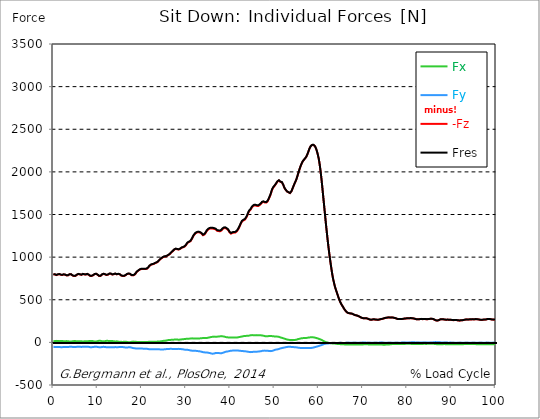
| Category |  Fx |  Fy |  -Fz |  Fres |
|---|---|---|---|---|
| 0.0 | 12.71 | -51.98 | 798.48 | 800.44 |
| 0.167348456675344 | 13.99 | -52.82 | 798.3 | 800.33 |
| 0.334696913350688 | 15.35 | -53.58 | 796.87 | 798.95 |
| 0.5020453700260321 | 16.6 | -54.59 | 793.1 | 795.28 |
| 0.669393826701376 | 17.56 | -55.71 | 789.18 | 791.46 |
| 0.83674228337672 | 16.47 | -55.96 | 790.77 | 793.04 |
| 1.0040907400520642 | 15.13 | -55.33 | 795.72 | 797.94 |
| 1.1621420602454444 | 14.09 | -54.38 | 800.67 | 802.81 |
| 1.3294905169207885 | 14.49 | -54.71 | 799.82 | 801.99 |
| 1.4968389735961325 | 15.13 | -55.06 | 797.65 | 799.87 |
| 1.6641874302714765 | 16.27 | -55.95 | 792.97 | 795.26 |
| 1.8315358869468206 | 17.29 | -57.16 | 788.36 | 790.74 |
| 1.9988843436221646 | 16.23 | -56.35 | 790.01 | 792.31 |
| 2.1662328002975086 | 14.96 | -55.09 | 793.04 | 795.24 |
| 2.333581256972853 | 13.81 | -53.45 | 796.71 | 798.78 |
| 2.5009297136481967 | 13.45 | -53.06 | 795.73 | 797.77 |
| 2.6682781703235405 | 13.52 | -53.58 | 793.1 | 795.17 |
| 2.8356266269988843 | 14.73 | -54.5 | 788.03 | 790.19 |
| 3.002975083674229 | 15.09 | -55.01 | 785.5 | 787.69 |
| 3.1703235403495724 | 14.38 | -54.78 | 784.9 | 787.06 |
| 3.337671997024917 | 13.45 | -54.58 | 786.51 | 788.63 |
| 3.4957233172182973 | 11.71 | -53.6 | 791.53 | 793.54 |
| 3.663071773893641 | 9.57 | -51.67 | 798.03 | 799.89 |
| 3.8304202305689854 | 8.76 | -50.57 | 800.06 | 801.84 |
| 3.997768687244329 | 9.16 | -50.6 | 798.48 | 800.27 |
| 4.165117143919673 | 11.25 | -51.6 | 792.11 | 793.99 |
| 4.332465600595017 | 13.64 | -53.29 | 784.07 | 786.12 |
| 4.499814057270361 | 15.28 | -54.84 | 777.87 | 780.09 |
| 4.667162513945706 | 15.01 | -55.09 | 778.17 | 780.4 |
| 4.834510970621049 | 14.51 | -54.27 | 779.33 | 781.48 |
| 5.001859427296393 | 15.25 | -54.46 | 780.16 | 782.32 |
| 5.169207883971737 | 14.04 | -53.6 | 784.96 | 787.03 |
| 5.336556340647081 | 11.99 | -52.13 | 793.8 | 795.75 |
| 5.503904797322425 | 11.73 | -51.16 | 799.26 | 801.15 |
| 5.671253253997769 | 11.71 | -50.92 | 801.78 | 803.64 |
| 5.82930457419115 | 11.84 | -50.97 | 801.59 | 803.45 |
| 5.996653030866494 | 12.63 | -51.83 | 796.91 | 798.84 |
| 6.164001487541838 | 13.67 | -53.29 | 791.19 | 793.24 |
| 6.331349944217181 | 13.41 | -53.65 | 792.16 | 794.23 |
| 6.498698400892526 | 11.94 | -52.54 | 796.41 | 798.37 |
| 6.66604685756787 | 10.03 | -50.76 | 801.65 | 803.46 |
| 6.833395314243213 | 11.13 | -51 | 801.01 | 802.85 |
| 7.000743770918558 | 12.66 | -51.61 | 797.61 | 799.51 |
| 7.168092227593902 | 13.29 | -52.18 | 793.81 | 795.76 |
| 7.335440684269246 | 12.67 | -51.96 | 795.3 | 797.23 |
| 7.50278914094459 | 11.94 | -51.52 | 799.44 | 801.33 |
| 7.6701375976199335 | 11.62 | -50.78 | 802.11 | 803.94 |
| 7.837486054295278 | 12.92 | -51.22 | 799.74 | 801.62 |
| 7.995537374488658 | 14.88 | -52.81 | 792.98 | 795.01 |
| 8.162885831164003 | 16.49 | -54.92 | 784.62 | 786.86 |
| 8.330234287839346 | 17.29 | -56.33 | 779.2 | 781.6 |
| 8.49758274451469 | 17.3 | -56.76 | 777.8 | 780.25 |
| 8.664931201190035 | 16.78 | -56.36 | 779.56 | 781.96 |
| 8.832279657865378 | 15.86 | -55.57 | 782.75 | 785.05 |
| 8.999628114540721 | 14.31 | -54.53 | 787.44 | 789.62 |
| 9.166976571216066 | 11.42 | -52.95 | 795.29 | 797.31 |
| 9.334325027891412 | 10.3 | -51.88 | 800.51 | 802.46 |
| 9.501673484566755 | 10.42 | -51.54 | 801.93 | 803.87 |
| 9.669021941242098 | 10.74 | -51.57 | 803.4 | 805.33 |
| 9.836370397917442 | 12.09 | -51.88 | 799.92 | 801.89 |
| 10.003718854592787 | 14.51 | -53.44 | 793.44 | 795.53 |
| 10.17106731126813 | 17.07 | -55.44 | 785.56 | 787.89 |
| 10.329118631461512 | 19.14 | -57.21 | 778.73 | 781.28 |
| 10.496467088136853 | 19.19 | -57.62 | 776.55 | 779.14 |
| 10.663815544812199 | 18.1 | -57.33 | 778.58 | 781.12 |
| 10.831164001487544 | 16.2 | -56.47 | 784.32 | 786.73 |
| 10.998512458162887 | 13.27 | -54.42 | 795.26 | 797.44 |
| 11.16586091483823 | 11.65 | -52.76 | 803.12 | 805.14 |
| 11.333209371513574 | 11.94 | -52.33 | 803.63 | 805.62 |
| 11.50055782818892 | 13.23 | -52.94 | 801.11 | 803.15 |
| 11.667906284864264 | 14.24 | -53.93 | 798 | 800.12 |
| 11.835254741539607 | 15.65 | -55.24 | 794.18 | 796.4 |
| 12.00260319821495 | 17.61 | -56.93 | 790.12 | 792.53 |
| 12.169951654890292 | 18.49 | -58.32 | 789.72 | 792.26 |
| 12.337300111565641 | 17.66 | -58.52 | 793.9 | 796.45 |
| 12.504648568240984 | 16.57 | -58.22 | 799.85 | 802.35 |
| 12.662699888434362 | 15.76 | -57.99 | 804.57 | 807.01 |
| 12.830048345109708 | 15.17 | -57.91 | 805.95 | 808.35 |
| 12.997396801785053 | 14.88 | -57.76 | 804.52 | 806.89 |
| 13.164745258460396 | 15.07 | -57.79 | 800.12 | 802.49 |
| 13.33209371513574 | 15.71 | -58.61 | 795.03 | 797.48 |
| 13.499442171811083 | 15.03 | -59.1 | 794.48 | 796.94 |
| 13.666790628486426 | 13.18 | -58 | 799.52 | 801.87 |
| 13.834139085161771 | 11.53 | -56.48 | 804.27 | 806.48 |
| 14.001487541837117 | 10.46 | -54.93 | 805.55 | 807.62 |
| 14.16883599851246 | 11.44 | -55.96 | 801.79 | 803.93 |
| 14.336184455187803 | 12.41 | -57.48 | 797.74 | 800 |
| 14.503532911863147 | 11.33 | -57.57 | 799.58 | 801.82 |
| 14.670881368538492 | 9.08 | -56.34 | 802.77 | 804.89 |
| 14.828932688731873 | 6.92 | -54.66 | 803.73 | 805.72 |
| 14.996281145407215 | 5.71 | -52.95 | 798.62 | 800.51 |
| 15.163629602082558 | 5.33 | -52.08 | 789.64 | 791.49 |
| 15.330978058757903 | 6 | -53.33 | 784.07 | 786.02 |
| 15.498326515433247 | 5.54 | -54.28 | 781.1 | 783.13 |
| 15.665674972108594 | 5.5 | -55.22 | 779.01 | 781.13 |
| 15.833023428783937 | 6.29 | -56.19 | 778.31 | 780.52 |
| 16.00037188545928 | 6.76 | -56.53 | 778.72 | 780.95 |
| 16.167720342134626 | 7.66 | -58.23 | 781.9 | 784.27 |
| 16.335068798809967 | 7.94 | -60.32 | 788.05 | 790.62 |
| 16.502417255485312 | 6.75 | -60.65 | 795.18 | 797.76 |
| 16.669765712160658 | 5.14 | -59.84 | 800.97 | 803.45 |
| 16.837114168836 | 4.05 | -59.47 | 803.78 | 806.19 |
| 17.004462625511344 | 2.31 | -57.94 | 805.92 | 808.21 |
| 17.16251394570472 | 2.06 | -57.41 | 804.7 | 806.93 |
| 17.32986240238007 | 2.01 | -56.88 | 802.66 | 804.86 |
| 17.497210859055414 | 3.69 | -57.95 | 796.56 | 798.84 |
| 17.664559315730756 | 6.47 | -60.9 | 787.46 | 789.95 |
| 17.8319077724061 | 8.69 | -64.31 | 784.78 | 787.6 |
| 17.999256229081443 | 9.11 | -66.56 | 785.8 | 788.83 |
| 18.166604685756788 | 8.49 | -67.29 | 788.91 | 792 |
| 18.333953142432133 | 8.23 | -68.98 | 792.84 | 796.07 |
| 18.501301599107478 | 7.6 | -70.06 | 800.13 | 803.44 |
| 18.668650055782823 | 7 | -71.29 | 811.71 | 815.08 |
| 18.835998512458165 | 5.53 | -72.07 | 826.08 | 829.44 |
| 19.00334696913351 | 4.21 | -71.64 | 835.07 | 838.36 |
| 19.170695425808855 | 3.64 | -71.47 | 839.72 | 842.96 |
| 19.338043882484197 | 3.87 | -72.07 | 844.02 | 847.3 |
| 19.496095202677576 | 3.92 | -72.8 | 852.61 | 855.92 |
| 19.66344365935292 | 4 | -73.18 | 858.04 | 861.37 |
| 19.830792116028263 | 3.94 | -73.09 | 859.12 | 862.44 |
| 19.998140572703612 | 3.7 | -72.9 | 859.35 | 862.66 |
| 20.165489029378953 | 4.18 | -73.22 | 859.76 | 863.1 |
| 20.3328374860543 | 4.61 | -73.54 | 860.1 | 863.48 |
| 20.500185942729644 | 4.45 | -73.94 | 859.58 | 862.97 |
| 20.667534399404985 | 4.3 | -74.34 | 859.06 | 862.46 |
| 20.83488285608033 | 3.58 | -74.49 | 859.85 | 863.25 |
| 21.002231312755672 | 2.96 | -74.71 | 861.01 | 864.39 |
| 21.16957976943102 | 3.37 | -75.55 | 864.44 | 867.88 |
| 21.336928226106362 | 4.07 | -76.82 | 870.19 | 873.73 |
| 21.504276682781704 | 6.87 | -79.52 | 880.35 | 884.12 |
| 21.67162513945705 | 8.54 | -80.72 | 893.44 | 897.26 |
| 21.82967645965043 | 8.65 | -80.5 | 903.01 | 906.75 |
| 21.997024916325774 | 8.21 | -80.21 | 908.14 | 911.81 |
| 22.16437337300112 | 8.51 | -80.18 | 912.27 | 915.94 |
| 22.33172182967646 | 8.46 | -79.86 | 914.8 | 918.43 |
| 22.499070286351806 | 7.3 | -79.21 | 916.49 | 920.03 |
| 22.666418743027148 | 7.7 | -79.41 | 918.88 | 922.44 |
| 22.833767199702496 | 8.45 | -80.59 | 923.25 | 926.9 |
| 23.00111565637784 | 8.54 | -81.04 | 928.75 | 932.42 |
| 23.168464113053183 | 8.43 | -80.58 | 932.04 | 935.64 |
| 23.335812569728528 | 8.48 | -80.55 | 935.45 | 939.04 |
| 23.50316102640387 | 9.03 | -80.86 | 940.36 | 943.98 |
| 23.670509483079215 | 9.41 | -81.26 | 947.14 | 950.78 |
| 23.83785793975456 | 10.11 | -82.38 | 956.5 | 960.21 |
| 23.995909259947936 | 10.62 | -82.07 | 966.6 | 970.27 |
| 24.163257716623285 | 11.1 | -82.03 | 975.08 | 978.72 |
| 24.330606173298627 | 12.54 | -82.35 | 982 | 985.68 |
| 24.49795462997397 | 14.63 | -82.95 | 989.75 | 993.5 |
| 24.665303086649313 | 16.26 | -83.08 | 994.36 | 998.12 |
| 24.83265154332466 | 17.55 | -82.87 | 999.33 | 1003.07 |
| 25.0 | 18.29 | -82.12 | 1004.49 | 1008.17 |
| 25.167348456675345 | 19.05 | -81.33 | 1005.83 | 1009.44 |
| 25.334696913350694 | 20.14 | -80.33 | 1007.4 | 1010.95 |
| 25.502045370026035 | 21.64 | -79.03 | 1009.26 | 1012.73 |
| 25.669393826701377 | 23.35 | -77.82 | 1013.22 | 1016.64 |
| 25.836742283376722 | 25.16 | -76.76 | 1017.84 | 1021.22 |
| 26.004090740052067 | 26.86 | -77.12 | 1023.89 | 1027.33 |
| 26.17143919672741 | 27.56 | -76.64 | 1028.71 | 1032.13 |
| 26.329490516920792 | 28.12 | -76.26 | 1035.89 | 1039.28 |
| 26.49683897359613 | 28.82 | -75.95 | 1045.49 | 1048.86 |
| 26.66418743027148 | 29.82 | -75.82 | 1054.14 | 1057.5 |
| 26.831535886946828 | 29.7 | -76.05 | 1061.34 | 1064.69 |
| 26.998884343622166 | 30.86 | -77.17 | 1070.51 | 1073.94 |
| 27.166232800297514 | 31.72 | -77.45 | 1080.44 | 1083.89 |
| 27.333581256972852 | 32.56 | -77.8 | 1087.71 | 1091.19 |
| 27.5009297136482 | 32.47 | -77.27 | 1092.62 | 1096.04 |
| 27.668278170323543 | 32.6 | -76.57 | 1096.59 | 1099.95 |
| 27.835626626998888 | 32.73 | -75.96 | 1096.48 | 1099.8 |
| 28.002975083674233 | 32.89 | -76.4 | 1092.22 | 1095.59 |
| 28.170323540349575 | 31.83 | -76.59 | 1087.85 | 1091.22 |
| 28.33767199702492 | 31.55 | -76.24 | 1088.71 | 1092.06 |
| 28.50502045370026 | 32.78 | -76.76 | 1090.98 | 1094.4 |
| 28.663071773893645 | 32.58 | -76.79 | 1096.63 | 1100.05 |
| 28.830420230568986 | 34.05 | -78.35 | 1102.92 | 1106.49 |
| 28.99776868724433 | 35.29 | -79.75 | 1110.07 | 1113.77 |
| 29.165117143919673 | 35.97 | -80.28 | 1112.37 | 1116.14 |
| 29.33246560059502 | 36.61 | -81.46 | 1115.08 | 1118.99 |
| 29.499814057270367 | 37.39 | -82.95 | 1118.26 | 1122.33 |
| 29.66716251394571 | 39.23 | -85.2 | 1123.55 | 1127.96 |
| 29.834510970621054 | 40.79 | -87.2 | 1129.91 | 1134.62 |
| 30.00185942729639 | 41.24 | -87.9 | 1141.13 | 1145.92 |
| 30.169207883971744 | 41.09 | -87.12 | 1155.29 | 1160.01 |
| 30.33655634064708 | 41.24 | -86.79 | 1167.37 | 1172.06 |
| 30.50390479732243 | 42.4 | -88.53 | 1173.14 | 1178 |
| 30.671253253997772 | 43.37 | -90.83 | 1176.84 | 1181.96 |
| 30.829304574191156 | 44.35 | -93.12 | 1180.54 | 1185.91 |
| 30.996653030866494 | 45.15 | -94.67 | 1186.3 | 1191.83 |
| 31.164001487541842 | 46.35 | -96.56 | 1197.31 | 1202.98 |
| 31.331349944217187 | 47.13 | -97.57 | 1214.39 | 1220.1 |
| 31.498698400892525 | 46.97 | -97.57 | 1232.78 | 1238.39 |
| 31.666046857567874 | 46.38 | -97.13 | 1248.3 | 1253.82 |
| 31.833395314243212 | 45.96 | -97.2 | 1261.91 | 1267.36 |
| 32.00074377091856 | 45.67 | -97.82 | 1273.25 | 1278.68 |
| 32.1680922275939 | 45.15 | -98.64 | 1281.15 | 1286.62 |
| 32.33544068426925 | 45.26 | -99.92 | 1286.41 | 1291.98 |
| 32.50278914094459 | 45.74 | -101.13 | 1289.81 | 1295.48 |
| 32.670137597619934 | 46.06 | -102.52 | 1292.23 | 1297.98 |
| 32.83748605429528 | 45.88 | -103.13 | 1293.41 | 1299.17 |
| 33.004834510970625 | 46.58 | -104.54 | 1290.72 | 1296.58 |
| 33.162885831164004 | 46.95 | -105.75 | 1287.79 | 1293.8 |
| 33.33023428783935 | 47.31 | -107.08 | 1284.04 | 1290.22 |
| 33.497582744514695 | 48.36 | -109.53 | 1276.33 | 1282.76 |
| 33.664931201190036 | 49.9 | -112.32 | 1264.85 | 1271.55 |
| 33.83227965786538 | 51.22 | -114.95 | 1256.28 | 1263.27 |
| 33.99962811454073 | 51.58 | -116.61 | 1258.37 | 1265.58 |
| 34.16697657121607 | 51.55 | -117.23 | 1265.72 | 1272.99 |
| 34.33432502789141 | 51.53 | -117.85 | 1274.72 | 1282.04 |
| 34.50167348456676 | 51.4 | -117.98 | 1289.16 | 1296.46 |
| 34.6690219412421 | 51.05 | -117.94 | 1305.75 | 1313.03 |
| 34.83637039791744 | 52.56 | -119.48 | 1316.03 | 1323.48 |
| 35.00371885459279 | 54.86 | -121.61 | 1325.04 | 1332.73 |
| 35.17106731126814 | 57.01 | -123.24 | 1331.28 | 1339.17 |
| 35.338415767943474 | 58.7 | -124.72 | 1334.18 | 1342.25 |
| 35.49646708813686 | 60.31 | -127.17 | 1335.94 | 1344.33 |
| 35.6638155448122 | 62.71 | -129.91 | 1336.74 | 1345.52 |
| 35.831164001487544 | 64.35 | -132.1 | 1336.25 | 1345.38 |
| 35.998512458162885 | 65.69 | -132.87 | 1335.2 | 1344.53 |
| 36.165860914838234 | 66.93 | -132.19 | 1333.94 | 1343.28 |
| 36.333209371513576 | 67.63 | -131 | 1330.81 | 1340.1 |
| 36.50055782818892 | 67.55 | -128.79 | 1327.94 | 1337.03 |
| 36.667906284864266 | 66.22 | -124.94 | 1326.21 | 1334.79 |
| 36.83525474153961 | 66.01 | -124.44 | 1318.38 | 1326.84 |
| 37.002603198214956 | 67.03 | -125.01 | 1309.05 | 1317.64 |
| 37.1699516548903 | 68.35 | -125.72 | 1302.44 | 1311.2 |
| 37.337300111565646 | 68.17 | -124.92 | 1305.35 | 1314 |
| 37.50464856824098 | 69.02 | -125.29 | 1305.44 | 1314.2 |
| 37.66269988843437 | 70.76 | -126.74 | 1303.08 | 1312.13 |
| 37.83004834510971 | 72.22 | -127.59 | 1304.7 | 1313.95 |
| 37.99739680178505 | 73.34 | -127.27 | 1311.31 | 1320.6 |
| 38.16474525846039 | 71.68 | -124.39 | 1324.32 | 1333.49 |
| 38.33209371513574 | 70.02 | -122 | 1333.14 | 1342.11 |
| 38.49944217181109 | 68.96 | -119.54 | 1338.01 | 1346.68 |
| 38.666790628486424 | 67.5 | -115.87 | 1341.61 | 1349.9 |
| 38.83413908516178 | 64.55 | -112.45 | 1342.02 | 1349.88 |
| 39.001487541837115 | 61.84 | -109.24 | 1339.39 | 1346.95 |
| 39.16883599851246 | 60.21 | -107.85 | 1332.95 | 1340.41 |
| 39.336184455187805 | 59.39 | -107.35 | 1326.34 | 1333.76 |
| 39.503532911863154 | 58.57 | -105.96 | 1320.04 | 1327.4 |
| 39.670881368538495 | 57.41 | -103.62 | 1310.34 | 1317.6 |
| 39.83822982521384 | 57.73 | -101 | 1290.32 | 1297.59 |
| 39.996281145407224 | 57.2 | -98.87 | 1278.66 | 1285.94 |
| 40.163629602082565 | 57.43 | -97.6 | 1275.36 | 1282.74 |
| 40.33097805875791 | 57.76 | -97.18 | 1278.59 | 1286.03 |
| 40.498326515433256 | 57.59 | -96.24 | 1285.36 | 1292.7 |
| 40.6656749721086 | 57.59 | -95.89 | 1289.72 | 1297.08 |
| 40.83302342878393 | 57.77 | -96.19 | 1287.09 | 1294.6 |
| 41.00037188545929 | 58.15 | -96.3 | 1286.35 | 1293.99 |
| 41.16772034213463 | 58.03 | -95.71 | 1289.16 | 1296.86 |
| 41.33506879880997 | 57.47 | -94.53 | 1295.58 | 1303.29 |
| 41.50241725548531 | 57.36 | -93.89 | 1303.88 | 1311.53 |
| 41.66976571216066 | 58.51 | -94.96 | 1315.3 | 1323.02 |
| 41.837114168836 | 60.46 | -96.16 | 1330.08 | 1337.89 |
| 42.004462625511344 | 62.22 | -97.72 | 1347.29 | 1355.1 |
| 42.17181108218669 | 64.09 | -99.26 | 1366.21 | 1374 |
| 42.32986240238007 | 65.63 | -99.67 | 1386.58 | 1394.3 |
| 42.497210859055414 | 67.08 | -99.51 | 1404.7 | 1412.32 |
| 42.66455931573076 | 69.08 | -100.64 | 1419.44 | 1427.08 |
| 42.831907772406105 | 71.3 | -101.92 | 1428.31 | 1436.08 |
| 42.999256229081446 | 73.37 | -102.89 | 1431.12 | 1439.1 |
| 43.16660468575679 | 74.57 | -103.07 | 1434.33 | 1442.41 |
| 43.33395314243214 | 75.72 | -104.21 | 1440.61 | 1448.82 |
| 43.50130159910748 | 76.39 | -105.87 | 1452 | 1460.29 |
| 43.66865005578282 | 76.29 | -106.95 | 1468.25 | 1476.49 |
| 43.83599851245817 | 76.5 | -107.8 | 1486.64 | 1494.86 |
| 44.00334696913351 | 77.36 | -109.53 | 1508.9 | 1517.21 |
| 44.17069542580886 | 78.33 | -111.86 | 1528.74 | 1537.14 |
| 44.3380438824842 | 79.82 | -113.17 | 1542.47 | 1551 |
| 44.49609520267758 | 82.98 | -115.41 | 1548.86 | 1557.96 |
| 44.66344365935292 | 84.73 | -114.4 | 1561.66 | 1570.68 |
| 44.83079211602827 | 85.17 | -113.12 | 1578.08 | 1586.93 |
| 44.99814057270361 | 85.18 | -112.63 | 1590.26 | 1599.05 |
| 45.16548902937895 | 84.4 | -111.15 | 1600.51 | 1609.11 |
| 45.332837486054295 | 83.64 | -109.26 | 1604.53 | 1612.94 |
| 45.500185942729644 | 83.8 | -108.34 | 1604.99 | 1613.3 |
| 45.66753439940499 | 83.81 | -108.85 | 1606.22 | 1614.55 |
| 45.83488285608033 | 84.42 | -109.07 | 1604.37 | 1612.78 |
| 46.00223131275568 | 85.11 | -108.7 | 1601.14 | 1609.61 |
| 46.16957976943102 | 84.14 | -108.53 | 1600.09 | 1608.45 |
| 46.336928226106366 | 83.17 | -108.36 | 1599.05 | 1607.29 |
| 46.50427668278171 | 82.99 | -108.22 | 1602.88 | 1611.12 |
| 46.671625139457056 | 82.87 | -105.35 | 1611.83 | 1619.69 |
| 46.829676459650436 | 83.17 | -104.35 | 1616.44 | 1624.25 |
| 46.99702491632577 | 82.26 | -103.15 | 1628.47 | 1636.19 |
| 47.16437337300112 | 80.72 | -100.03 | 1641.27 | 1648.68 |
| 47.33172182967646 | 79.49 | -97.81 | 1646.49 | 1653.65 |
| 47.49907028635181 | 78.87 | -96.9 | 1647.71 | 1654.75 |
| 47.66641874302716 | 76 | -96.71 | 1640.34 | 1647.19 |
| 47.83376719970249 | 73.57 | -97.89 | 1639.78 | 1646.6 |
| 48.001115656377834 | 71.19 | -97.02 | 1637.68 | 1644.33 |
| 48.16846411305319 | 70.36 | -96.78 | 1640.13 | 1646.65 |
| 48.33581256972853 | 71.13 | -97.46 | 1646.28 | 1652.96 |
| 48.50316102640387 | 72.5 | -98.9 | 1658.68 | 1665.65 |
| 48.67050948307921 | 73.58 | -100.15 | 1677.93 | 1685.08 |
| 48.837857939754564 | 74.88 | -101.55 | 1697.57 | 1704.87 |
| 49.005206396429905 | 75.72 | -102.65 | 1716.75 | 1724.09 |
| 49.163257716623285 | 75.58 | -102.8 | 1741.78 | 1748.99 |
| 49.33060617329863 | 74.23 | -100.96 | 1770.72 | 1777.51 |
| 49.49795462997397 | 72.66 | -99.08 | 1795.29 | 1801.68 |
| 49.66530308664932 | 71.4 | -97.28 | 1812.11 | 1818.21 |
| 49.832651543324666 | 70.64 | -93.46 | 1820.67 | 1826.4 |
| 50.0 | 70.06 | -89.34 | 1834.14 | 1839.43 |
| 50.16734845667534 | 69.36 | -87.01 | 1845.96 | 1850.94 |
| 50.33469691335069 | 68.53 | -84.95 | 1858.51 | 1863.19 |
| 50.50204537002604 | 67.55 | -83.73 | 1873.15 | 1877.65 |
| 50.66939382670139 | 67.47 | -82.04 | 1886.02 | 1890.34 |
| 50.836742283376715 | 66.31 | -79.27 | 1895.31 | 1899.28 |
| 51.00409074005207 | 65.36 | -77.24 | 1898.52 | 1902.18 |
| 51.17143919672741 | 61.54 | -74.08 | 1889.45 | 1892.76 |
| 51.32949051692079 | 57.37 | -71.29 | 1883.01 | 1886.01 |
| 51.496838973596134 | 54.88 | -68.73 | 1882.63 | 1885.42 |
| 51.66418743027148 | 53.46 | -66.69 | 1877.89 | 1880.52 |
| 51.831535886946824 | 50.85 | -64.45 | 1866.5 | 1868.96 |
| 51.99888434362217 | 47.93 | -62.62 | 1845.68 | 1847.92 |
| 52.16623280029752 | 45.05 | -61.08 | 1820.69 | 1822.72 |
| 52.33358125697285 | 42.3 | -59.66 | 1804.49 | 1806.36 |
| 52.5009297136482 | 38.9 | -57.12 | 1790.84 | 1792.46 |
| 52.668278170323546 | 36.49 | -55.62 | 1782.06 | 1783.55 |
| 52.835626626998895 | 33.89 | -54.59 | 1770.06 | 1771.46 |
| 53.00297508367424 | 31.8 | -52.63 | 1764.07 | 1765.38 |
| 53.17032354034958 | 30.01 | -50.38 | 1760.83 | 1762.08 |
| 53.33767199702492 | 29.28 | -51.15 | 1754.81 | 1756.04 |
| 53.50502045370027 | 29.02 | -52.54 | 1750.8 | 1752.02 |
| 53.663071773893655 | 27.74 | -52.7 | 1758.47 | 1759.62 |
| 53.83042023056899 | 27.4 | -53.61 | 1772.47 | 1773.62 |
| 53.99776868724433 | 27.4 | -53.64 | 1794 | 1795.13 |
| 54.16511714391967 | 27.32 | -54.65 | 1815.69 | 1816.83 |
| 54.33246560059503 | 27.24 | -55.65 | 1837.39 | 1838.53 |
| 54.49981405727037 | 27.62 | -56.87 | 1858.26 | 1859.42 |
| 54.667162513945705 | 28.89 | -58.16 | 1877.68 | 1878.9 |
| 54.834510970621054 | 30.49 | -58.25 | 1897.12 | 1898.34 |
| 55.0018594272964 | 32.19 | -58.74 | 1919.62 | 1920.86 |
| 55.169207883971744 | 34.81 | -60.19 | 1947.49 | 1948.8 |
| 55.336556340647086 | 38.56 | -62.16 | 1976.67 | 1978.08 |
| 55.50390479732243 | 40.23 | -63.02 | 2004.48 | 2005.93 |
| 55.671253253997776 | 42.25 | -64.32 | 2032.03 | 2033.55 |
| 55.83860171067312 | 44.89 | -65.48 | 2057.14 | 2058.74 |
| 55.9966530308665 | 46.64 | -65.78 | 2079.57 | 2081.21 |
| 56.16400148754184 | 47.91 | -65.84 | 2100.04 | 2101.7 |
| 56.33134994421718 | 49.48 | -65.8 | 2118.31 | 2119.99 |
| 56.498698400892536 | 50.05 | -65.36 | 2131.21 | 2132.88 |
| 56.66604685756788 | 50.53 | -65.2 | 2141.93 | 2143.6 |
| 56.83339531424321 | 50.71 | -65.01 | 2152.38 | 2154.04 |
| 57.00074377091856 | 50.89 | -64.81 | 2162.83 | 2164.49 |
| 57.16809222759391 | 51.2 | -64.69 | 2174.48 | 2176.14 |
| 57.33544068426925 | 53.04 | -65.61 | 2192.89 | 2194.61 |
| 57.5027891409446 | 54.85 | -66.62 | 2213.92 | 2215.71 |
| 57.670137597619934 | 56.37 | -66.85 | 2237.43 | 2239.25 |
| 57.83748605429528 | 57.59 | -66.42 | 2262.35 | 2264.18 |
| 58.004834510970625 | 58.44 | -66.25 | 2282.35 | 2284.18 |
| 58.16288583116401 | 58.93 | -65.56 | 2299.05 | 2300.86 |
| 58.330234287839346 | 59.86 | -64.98 | 2309.8 | 2311.61 |
| 58.497582744514695 | 60.29 | -64.28 | 2315.02 | 2316.81 |
| 58.66493120119004 | 59.96 | -62.91 | 2317.16 | 2318.9 |
| 58.832279657865385 | 58.93 | -60.51 | 2316.31 | 2317.97 |
| 58.999628114540734 | 56.92 | -57.55 | 2310.26 | 2311.81 |
| 59.16697657121607 | 54.93 | -55.04 | 2298.95 | 2300.4 |
| 59.33432502789142 | 53.06 | -52.96 | 2280.06 | 2281.44 |
| 59.50167348456676 | 50.86 | -50.7 | 2257.35 | 2258.65 |
| 59.66902194124211 | 48.11 | -48.04 | 2228.02 | 2229.18 |
| 59.83637039791745 | 44.93 | -45.4 | 2193.26 | 2194.32 |
| 60.00371885459278 | 42.24 | -42.96 | 2154.67 | 2155.64 |
| 60.17106731126813 | 39.06 | -40.14 | 2103.51 | 2104.39 |
| 60.33841576794349 | 35.72 | -36.91 | 2042.53 | 2043.3 |
| 60.49646708813685 | 32.27 | -34.11 | 1970.63 | 1971.31 |
| 60.6638155448122 | 28.04 | -30.96 | 1893.32 | 1893.91 |
| 60.831164001487544 | 23.55 | -27.67 | 1807.62 | 1808.13 |
| 60.99851245816289 | 18.38 | -23.65 | 1718.54 | 1718.96 |
| 61.16586091483824 | 13.49 | -20.4 | 1632.52 | 1632.89 |
| 61.333209371513576 | 8.9 | -17.92 | 1544.35 | 1544.66 |
| 61.50055782818892 | 5.22 | -16.1 | 1456.01 | 1456.29 |
| 61.667906284864266 | 1.99 | -14.65 | 1370.09 | 1370.34 |
| 61.835254741539615 | -0.72 | -13.7 | 1288.55 | 1288.79 |
| 62.002603198214956 | -2.68 | -13.2 | 1210.22 | 1210.45 |
| 62.16995165489029 | -5.03 | -12.2 | 1134.24 | 1134.48 |
| 62.33730011156564 | -6.78 | -11.29 | 1063.54 | 1063.8 |
| 62.504648568240995 | -8.14 | -10.14 | 997.71 | 998 |
| 62.67199702491633 | -9.57 | -8.79 | 935.32 | 935.62 |
| 62.83004834510971 | -11 | -8.14 | 875.09 | 875.41 |
| 62.99739680178505 | -12.11 | -7.84 | 819 | 819.35 |
| 63.1647452584604 | -12.93 | -7.66 | 767.82 | 768.2 |
| 63.33209371513575 | -13.48 | -7.67 | 725.99 | 726.4 |
| 63.4994421718111 | -13.45 | -8.38 | 688.77 | 689.17 |
| 63.666790628486424 | -13.8 | -8.54 | 653.74 | 654.1 |
| 63.83413908516177 | -15.25 | -7.67 | 624.94 | 625.28 |
| 64.00148754183712 | -17.02 | -6.77 | 599.42 | 599.78 |
| 64.16883599851248 | -18.52 | -6.13 | 574.29 | 574.67 |
| 64.3361844551878 | -19.2 | -6.04 | 547.18 | 547.6 |
| 64.50353291186315 | -19.59 | -5.72 | 522.25 | 522.69 |
| 64.6708813685385 | -19.57 | -5.99 | 498.19 | 498.66 |
| 64.83822982521384 | -21.3 | -5.51 | 477.34 | 477.91 |
| 65.00557828188919 | -21.8 | -5.57 | 458.42 | 459.03 |
| 65.16362960208257 | -21.52 | -5.78 | 442.37 | 443 |
| 65.3309780587579 | -21.08 | -6.99 | 428.99 | 429.65 |
| 65.49832651543326 | -22.16 | -6.3 | 416.26 | 417.01 |
| 65.6656749721086 | -22.92 | -5.99 | 399.89 | 400.7 |
| 65.83302342878395 | -23.35 | -6.21 | 385.7 | 386.58 |
| 66.00037188545929 | -24.26 | -5.93 | 374.21 | 375.16 |
| 66.16772034213463 | -24.74 | -5.84 | 363.37 | 364.39 |
| 66.33506879880998 | -24.98 | -5.61 | 354.31 | 355.39 |
| 66.50241725548531 | -25.19 | -5.22 | 347.8 | 348.91 |
| 66.66976571216065 | -25.15 | -5.31 | 344.6 | 345.72 |
| 66.83711416883601 | -25 | -5.34 | 342.04 | 343.15 |
| 67.00446262551135 | -24.76 | -5.34 | 339.97 | 341.09 |
| 67.1718110821867 | -24.82 | -4.95 | 338.74 | 339.85 |
| 67.32986240238007 | -24.94 | -4.53 | 337.67 | 338.78 |
| 67.49721085905541 | -24.92 | -4.39 | 336.38 | 337.5 |
| 67.66455931573076 | -24.86 | -4.28 | 334.08 | 335.2 |
| 67.83190777240611 | -24.72 | -4.25 | 328.64 | 329.76 |
| 67.99925622908145 | -24.74 | -4.13 | 323.47 | 324.61 |
| 68.16660468575678 | -24.59 | -3.88 | 319.62 | 320.76 |
| 68.33395314243214 | -24.04 | -3.57 | 318.2 | 319.3 |
| 68.50130159910749 | -24.03 | -3.65 | 316.42 | 317.54 |
| 68.66865005578282 | -24.08 | -3.46 | 313.6 | 314.73 |
| 68.83599851245816 | -24.12 | -3.23 | 310.57 | 311.71 |
| 69.00334696913352 | -24.12 | -3.03 | 307.66 | 308.81 |
| 69.17069542580886 | -24.04 | -3.08 | 303.07 | 304.22 |
| 69.3380438824842 | -23.95 | -3.2 | 297.84 | 299.01 |
| 69.50539233915956 | -24.12 | -3.28 | 292.48 | 293.66 |
| 69.66344365935292 | -24.25 | -3.21 | 287.92 | 289.11 |
| 69.83079211602826 | -24.23 | -2.75 | 285.54 | 286.72 |
| 69.99814057270362 | -23.79 | -2.72 | 283.74 | 284.87 |
| 70.16548902937896 | -23.39 | -2.62 | 282.27 | 283.35 |
| 70.33283748605429 | -23.04 | -2.48 | 282.02 | 283.06 |
| 70.50018594272964 | -22.46 | -2.86 | 282.41 | 283.42 |
| 70.667534399405 | -22.67 | -2.86 | 282.68 | 283.73 |
| 70.83488285608033 | -23.23 | -3.02 | 281.74 | 282.85 |
| 71.00223131275568 | -23.36 | -3.62 | 278.98 | 280.14 |
| 71.16957976943102 | -23.31 | -4.27 | 275.16 | 276.35 |
| 71.33692822610637 | -23.67 | -4.19 | 271.49 | 272.73 |
| 71.50427668278171 | -24.02 | -4.11 | 267.81 | 269.1 |
| 71.67162513945706 | -24.41 | -4.14 | 265.83 | 267.17 |
| 71.8389735961324 | -24.8 | -4.19 | 264.19 | 265.58 |
| 71.99702491632577 | -25.23 | -4.11 | 264.86 | 266.29 |
| 72.16437337300113 | -25.56 | -4.05 | 267.66 | 269.12 |
| 72.33172182967647 | -25.61 | -4.21 | 269.99 | 271.45 |
| 72.49907028635181 | -25.65 | -4.17 | 270.17 | 271.64 |
| 72.66641874302715 | -25.28 | -4.56 | 267.98 | 269.45 |
| 72.8337671997025 | -24.29 | -5.28 | 266.28 | 267.64 |
| 73.00111565637783 | -24.39 | -4.53 | 266.03 | 267.4 |
| 73.16846411305319 | -24.9 | -4.08 | 265.32 | 266.77 |
| 73.33581256972853 | -25.24 | -3.65 | 264.73 | 266.24 |
| 73.50316102640387 | -25.1 | -3.29 | 264.49 | 266 |
| 73.67050948307921 | -25.52 | -2.92 | 265.99 | 267.55 |
| 73.83785793975457 | -26.01 | -2.79 | 268.94 | 270.54 |
| 74.00520639642991 | -26.35 | -2.72 | 271.65 | 273.29 |
| 74.16325771662328 | -26.19 | -2.52 | 273.13 | 274.73 |
| 74.33060617329863 | -26.34 | -2.6 | 274.57 | 276.19 |
| 74.49795462997398 | -26.87 | -3 | 276.47 | 278.15 |
| 74.66530308664932 | -26.62 | -3.6 | 279.74 | 281.38 |
| 74.83265154332466 | -26.74 | -3.69 | 282.95 | 284.62 |
| 75.00000000000001 | -26.72 | -3.88 | 285.81 | 287.51 |
| 75.16734845667534 | -25.88 | -4.45 | 287.27 | 288.79 |
| 75.3346969133507 | -25.79 | -4.19 | 287.75 | 289.25 |
| 75.50204537002605 | -25.46 | -4.11 | 289.6 | 291.06 |
| 75.66939382670138 | -24.61 | -3.93 | 292.95 | 294.24 |
| 75.83674228337672 | -24.13 | -4.4 | 292.46 | 293.72 |
| 76.00409074005208 | -23.64 | -4.87 | 291.97 | 293.2 |
| 76.17143919672742 | -23.01 | -4.97 | 291.16 | 292.32 |
| 76.33878765340276 | -22.09 | -5.49 | 291.51 | 292.58 |
| 76.49683897359614 | -20.41 | -5.48 | 292.38 | 293.28 |
| 76.66418743027148 | -19.29 | -4.81 | 292.54 | 293.36 |
| 76.83153588694682 | -18.44 | -5.02 | 290.27 | 291.04 |
| 76.99888434362218 | -18.09 | -5.4 | 285.75 | 286.51 |
| 77.16623280029752 | -18.25 | -5.04 | 285.6 | 286.37 |
| 77.33358125697285 | -18.19 | -4.88 | 286.18 | 286.97 |
| 77.5009297136482 | -17.81 | -5.58 | 280.99 | 281.81 |
| 77.66827817032356 | -18.24 | -4.9 | 277.58 | 278.43 |
| 77.83562662699889 | -18.65 | -4.88 | 273.89 | 274.79 |
| 78.00297508367423 | -18.61 | -4.63 | 272.89 | 273.81 |
| 78.17032354034959 | -18.59 | -4.02 | 272.73 | 273.66 |
| 78.33767199702493 | -18.58 | -3.41 | 272.57 | 273.5 |
| 78.50502045370027 | -18.59 | -3.02 | 272.71 | 273.65 |
| 78.67236891037561 | -18.61 | -2.81 | 273.09 | 274.05 |
| 78.83042023056899 | -18.82 | -2.37 | 273.81 | 274.77 |
| 78.99776868724433 | -19.1 | -1.85 | 274.64 | 275.63 |
| 79.16511714391969 | -18.99 | -1.57 | 276.46 | 277.44 |
| 79.33246560059503 | -18.42 | -1.75 | 279.06 | 279.98 |
| 79.49981405727036 | -17.77 | -1.55 | 279.51 | 280.42 |
| 79.66716251394571 | -17.36 | -0.84 | 280.17 | 281.09 |
| 79.83451097062107 | -17.17 | 0.02 | 281.15 | 282.06 |
| 80.00185942729641 | -17.09 | -0.24 | 281.23 | 282.11 |
| 80.16920788397174 | -16.84 | -1.04 | 281.88 | 282.67 |
| 80.33655634064709 | -16.46 | -2.04 | 283.07 | 283.79 |
| 80.50390479732243 | -16.94 | -1.57 | 282.89 | 283.63 |
| 80.67125325399778 | -16.97 | -1.02 | 283.54 | 284.29 |
| 80.83860171067312 | -17.4 | -0.54 | 284.46 | 285.26 |
| 80.99665303086651 | -18.21 | 0.33 | 282.97 | 283.85 |
| 81.16400148754184 | -18.73 | 0.79 | 281.97 | 282.91 |
| 81.3313499442172 | -19.38 | 0.92 | 282.03 | 283 |
| 81.49869840089255 | -19.29 | 0.39 | 280 | 280.94 |
| 81.66604685756786 | -19.73 | 0.29 | 277.52 | 278.49 |
| 81.83339531424322 | -19.66 | 0.08 | 274.51 | 275.46 |
| 82.00074377091858 | -18.78 | -0.79 | 270.76 | 271.6 |
| 82.16809222759392 | -18.7 | -1.06 | 270.25 | 271.08 |
| 82.33544068426926 | -18.61 | -1.4 | 270.41 | 271.24 |
| 82.50278914094459 | -18.4 | -1.94 | 270.61 | 271.43 |
| 82.67013759761994 | -18.41 | -2.22 | 272.52 | 273.32 |
| 82.83748605429528 | -18.01 | -2 | 272.06 | 272.81 |
| 83.00483451097062 | -18.07 | -1.95 | 272.57 | 273.33 |
| 83.17218296764597 | -18.07 | -1.57 | 274.97 | 275.74 |
| 83.33023428783935 | -17.78 | -2 | 273.09 | 273.87 |
| 83.4975827445147 | -18.05 | -1.71 | 271.85 | 272.68 |
| 83.66493120119004 | -17.64 | -1.42 | 273.28 | 274.08 |
| 83.83227965786537 | -17.42 | -1.36 | 274.16 | 274.97 |
| 83.99962811454073 | -17.58 | -1.16 | 274.13 | 274.98 |
| 84.16697657121607 | -17.65 | -1.22 | 272.43 | 273.28 |
| 84.33432502789142 | -17.78 | -0.63 | 273.37 | 274.21 |
| 84.50167348456677 | -17.62 | -0.49 | 271.63 | 272.43 |
| 84.6690219412421 | -17.39 | -0.6 | 271.28 | 272.06 |
| 84.83637039791745 | -17.18 | -0.69 | 272.95 | 273.72 |
| 85.0037188545928 | -17.23 | -0.85 | 274.7 | 275.47 |
| 85.17106731126813 | -17.02 | -0.93 | 275.69 | 276.45 |
| 85.33841576794349 | -17.24 | -0.41 | 276.6 | 277.35 |
| 85.50576422461883 | -16.59 | -0.94 | 276.14 | 276.84 |
| 85.66381554481221 | -16.52 | -0.63 | 275.19 | 275.89 |
| 85.83116400148755 | -16.78 | 0.14 | 274.73 | 275.44 |
| 85.99851245816289 | -16.97 | 0.39 | 270.55 | 271.27 |
| 86.16586091483823 | -18.32 | 2.49 | 265.86 | 266.73 |
| 86.33320937151358 | -19.66 | 3.35 | 261.81 | 262.84 |
| 86.50055782818893 | -20.17 | 3.22 | 257.71 | 258.76 |
| 86.66790628486427 | -20.87 | 2.66 | 255.5 | 256.61 |
| 86.83525474153961 | -21.21 | 2.42 | 255.45 | 256.58 |
| 87.00260319821496 | -21.44 | 2.61 | 256.89 | 258.02 |
| 87.16995165489031 | -21.21 | 2.21 | 260.12 | 261.2 |
| 87.33730011156564 | -20.67 | 0.9 | 265.45 | 266.41 |
| 87.504648568241 | -20.52 | -0.27 | 269.67 | 270.61 |
| 87.67199702491634 | -20.81 | -0.77 | 271.02 | 271.99 |
| 87.83004834510972 | -20.8 | -1.67 | 270.61 | 271.59 |
| 87.99739680178506 | -20.83 | -1.87 | 270.21 | 271.2 |
| 88.1647452584604 | -20.83 | -1.71 | 269.93 | 270.92 |
| 88.33209371513574 | -20.32 | -2.24 | 268.43 | 269.38 |
| 88.49944217181108 | -20.13 | -2.3 | 266.85 | 267.79 |
| 88.66679062848644 | -20.65 | -2.36 | 266.03 | 267 |
| 88.83413908516178 | -21.19 | -2.54 | 265.16 | 266.16 |
| 89.00148754183712 | -21.86 | -2.57 | 266.44 | 267.49 |
| 89.16883599851246 | -22.08 | -2.8 | 266.3 | 267.38 |
| 89.33618445518782 | -22.03 | -3.09 | 265.23 | 266.33 |
| 89.50353291186315 | -22.34 | -3 | 264.22 | 265.36 |
| 89.6708813685385 | -22.83 | -2.86 | 263.71 | 264.91 |
| 89.83822982521386 | -23.2 | -3.05 | 264.31 | 265.56 |
| 90.00557828188919 | -23.23 | -3.02 | 264.5 | 265.78 |
| 90.16362960208257 | -23.6 | -3.24 | 261.75 | 263.11 |
| 90.3309780587579 | -23.39 | -3.7 | 259.85 | 261.22 |
| 90.49832651543326 | -23.39 | -3.55 | 259.76 | 261.13 |
| 90.66567497210859 | -22.44 | -4.34 | 260.78 | 262.02 |
| 90.83302342878395 | -22.11 | -4.41 | 262.5 | 263.68 |
| 91.00037188545929 | -22.16 | -4.77 | 261.96 | 263.16 |
| 91.16772034213463 | -22.38 | -5.1 | 261.03 | 262.28 |
| 91.33506879880998 | -22.58 | -5.46 | 260.1 | 261.4 |
| 91.50241725548533 | -22.67 | -5.83 | 257.84 | 259.19 |
| 91.66976571216065 | -22.73 | -6.03 | 255.74 | 257.12 |
| 91.83711416883601 | -22.78 | -5.74 | 256.09 | 257.46 |
| 92.00446262551137 | -22.81 | -5.33 | 257.51 | 258.84 |
| 92.1718110821867 | -22.75 | -4.98 | 258.24 | 259.52 |
| 92.33915953886203 | -22.3 | -4.69 | 258.64 | 259.85 |
| 92.49721085905541 | -21.84 | -4.29 | 259.08 | 260.23 |
| 92.66455931573077 | -21.28 | -4.14 | 260.25 | 261.32 |
| 92.83190777240611 | -20.33 | -4.39 | 263.34 | 264.29 |
| 92.99925622908145 | -19.57 | -4.27 | 265.51 | 266.38 |
| 93.1666046857568 | -19.22 | -4.15 | 266.4 | 267.24 |
| 93.33395314243214 | -19.5 | -3.7 | 267.79 | 268.65 |
| 93.50130159910749 | -19.7 | -3.36 | 268.89 | 269.76 |
| 93.66865005578283 | -19.59 | -3.46 | 268.56 | 269.42 |
| 93.83599851245818 | -19.46 | -3.34 | 267.71 | 268.57 |
| 94.00334696913353 | -19 | -3.17 | 269.56 | 270.37 |
| 94.17069542580886 | -18.61 | -3.22 | 269.74 | 270.53 |
| 94.3380438824842 | -18.8 | -3.45 | 269.14 | 269.96 |
| 94.50539233915954 | -19.37 | -3.47 | 269.64 | 270.52 |
| 94.66344365935292 | -20.04 | -3.56 | 269.38 | 270.32 |
| 94.83079211602828 | -20.04 | -4.07 | 269.97 | 270.9 |
| 94.99814057270362 | -20.06 | -4.3 | 269.64 | 270.59 |
| 95.16548902937897 | -20.19 | -4.21 | 269.4 | 270.36 |
| 95.33283748605432 | -20.36 | -4.07 | 270.41 | 271.37 |
| 95.50018594272963 | -20.56 | -3.92 | 272.73 | 273.68 |
| 95.66753439940499 | -20.74 | -3.83 | 272.38 | 273.34 |
| 95.83488285608034 | -20.89 | -4.01 | 270.74 | 271.73 |
| 96.00223131275567 | -20.67 | -4.11 | 269.72 | 270.68 |
| 96.16957976943102 | -20.52 | -4.19 | 268.52 | 269.48 |
| 96.33692822610638 | -21 | -3.73 | 266.37 | 267.38 |
| 96.50427668278171 | -20.87 | -3.93 | 264.66 | 265.68 |
| 96.67162513945706 | -20.78 | -4.03 | 264.01 | 265.03 |
| 96.8389735961324 | -21.37 | -3.73 | 262.95 | 264.01 |
| 96.99702491632577 | -21.67 | -3.45 | 265.11 | 266.17 |
| 97.16437337300111 | -21.38 | -3.5 | 265.89 | 266.91 |
| 97.33172182967647 | -21.11 | -3.6 | 266.54 | 267.54 |
| 97.49907028635181 | -20.91 | -3.85 | 266.87 | 267.87 |
| 97.66641874302715 | -21.03 | -4 | 266.95 | 267.96 |
| 97.8337671997025 | -21.48 | -3.75 | 268.25 | 269.29 |
| 98.00111565637785 | -22.09 | -2.84 | 272.36 | 273.43 |
| 98.16846411305319 | -21.69 | -4.07 | 273.31 | 274.35 |
| 98.33581256972855 | -21.73 | -4.26 | 273.77 | 274.8 |
| 98.50316102640389 | -21.73 | -4.4 | 273.88 | 274.91 |
| 98.67050948307921 | -21.19 | -4.77 | 273.6 | 274.61 |
| 98.83785793975456 | -21.62 | -4.34 | 271.78 | 272.83 |
| 99.0052063964299 | -21.46 | -4.62 | 269 | 270.05 |
| 99.17255485310525 | -21.53 | -4.53 | 267.91 | 268.96 |
| 99.33060617329863 | -21.68 | -4.42 | 267.67 | 268.73 |
| 99.49795462997399 | -21.53 | -4.64 | 266.82 | 267.87 |
| 99.66530308664933 | -21.6 | -4.46 | 265.33 | 266.38 |
| 99.83265154332467 | -22.05 | -3.96 | 265.65 | 266.74 |
| 100.0 | -22.55 | -3.58 | 267.04 | 268.16 |